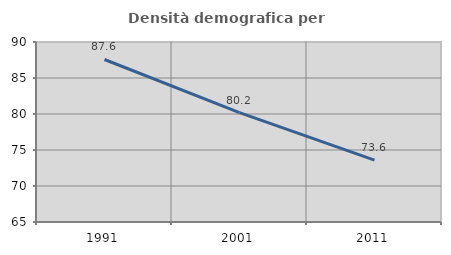
| Category | Densità demografica |
|---|---|
| 1991.0 | 87.57 |
| 2001.0 | 80.181 |
| 2011.0 | 73.597 |